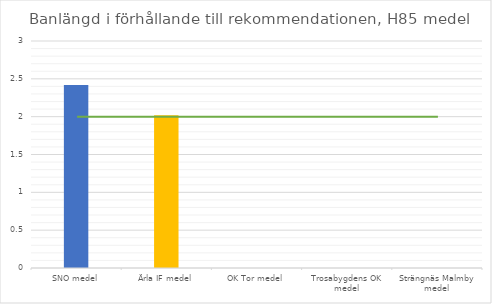
| Category | H85 längd |
|---|---|
| SNO medel | 2.42 |
| Ärla IF medel | 2.02 |
| OK Tor medel | 0 |
| Trosabygdens OK medel | 0 |
| Strängnäs Malmby medel | 0 |